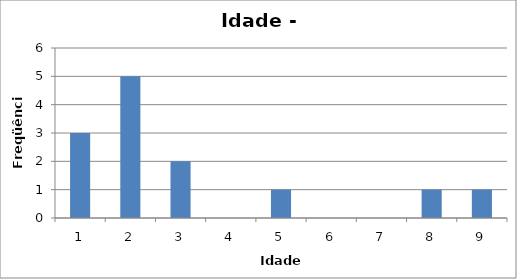
| Category | Series 0 |
|---|---|
| 0 | 3 |
| 1 | 5 |
| 2 | 2 |
| 3 | 0 |
| 4 | 1 |
| 5 | 0 |
| 6 | 0 |
| 7 | 1 |
| 8 | 1 |